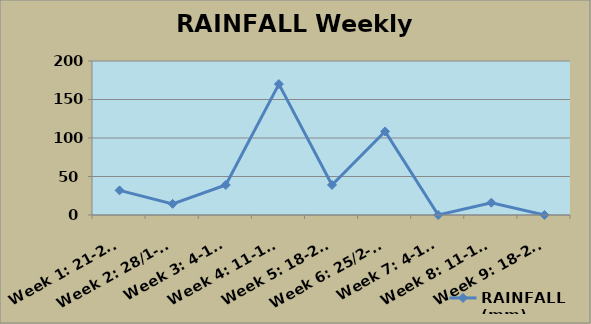
| Category | RAINFALL (mm) |
|---|---|
| Week 1: 21-27/1 | 32 |
| Week 2: 28/1-3/2 | 14.5 |
| Week 3: 4-10/2 | 39 |
| Week 4: 11-17/2 | 170 |
| Week 5: 18-24/2 | 39 |
| Week 6: 25/2-3/3 | 108.5 |
| Week 7: 4-10/3 | 0 |
| Week 8: 11-17/3 | 16 |
| Week 9: 18-20/3 | 0 |